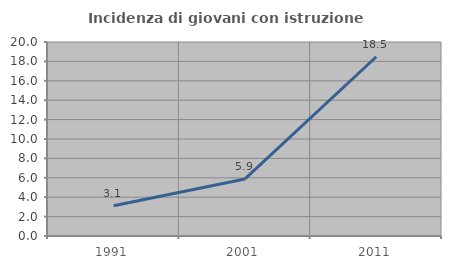
| Category | Incidenza di giovani con istruzione universitaria |
|---|---|
| 1991.0 | 3.125 |
| 2001.0 | 5.882 |
| 2011.0 | 18.478 |